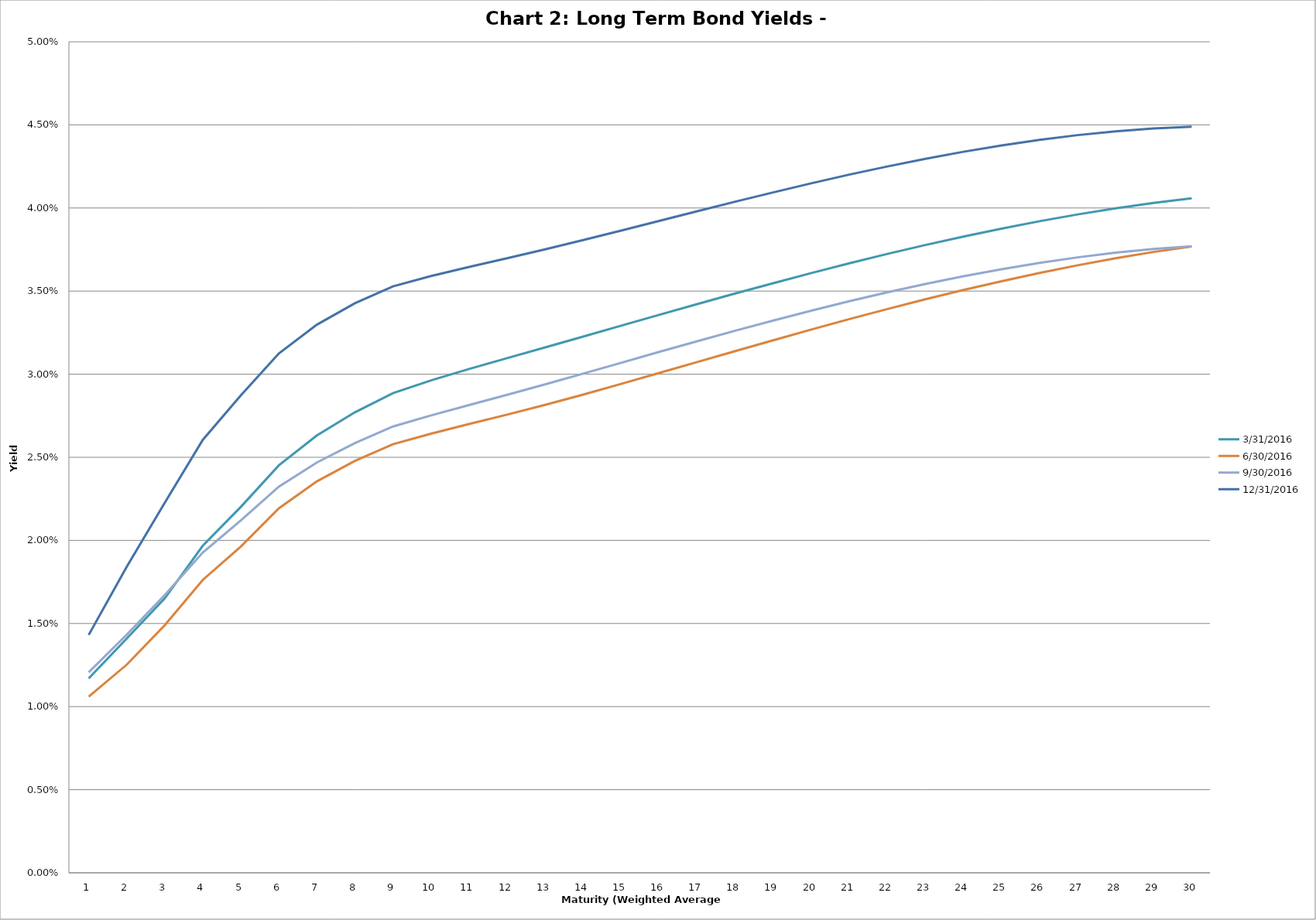
| Category | 3/31/2016 | 6/30/2016 | 9/30/2016 | 12/31/2016 |
|---|---|---|---|---|
| 0 | 0.012 | 0.011 | 0.012 | 0.014 |
| 1 | 0.014 | 0.013 | 0.014 | 0.018 |
| 2 | 0.017 | 0.015 | 0.017 | 0.022 |
| 3 | 0.02 | 0.018 | 0.019 | 0.026 |
| 4 | 0.022 | 0.02 | 0.021 | 0.029 |
| 5 | 0.025 | 0.022 | 0.023 | 0.031 |
| 6 | 0.026 | 0.024 | 0.025 | 0.033 |
| 7 | 0.028 | 0.025 | 0.026 | 0.034 |
| 8 | 0.029 | 0.026 | 0.027 | 0.035 |
| 9 | 0.03 | 0.026 | 0.028 | 0.036 |
| 10 | 0.03 | 0.027 | 0.028 | 0.036 |
| 11 | 0.031 | 0.028 | 0.029 | 0.037 |
| 12 | 0.032 | 0.028 | 0.029 | 0.038 |
| 13 | 0.032 | 0.029 | 0.03 | 0.038 |
| 14 | 0.033 | 0.029 | 0.031 | 0.039 |
| 15 | 0.034 | 0.03 | 0.031 | 0.039 |
| 16 | 0.034 | 0.031 | 0.032 | 0.04 |
| 17 | 0.035 | 0.031 | 0.033 | 0.04 |
| 18 | 0.035 | 0.032 | 0.033 | 0.041 |
| 19 | 0.036 | 0.033 | 0.034 | 0.041 |
| 20 | 0.037 | 0.033 | 0.034 | 0.042 |
| 21 | 0.037 | 0.034 | 0.035 | 0.043 |
| 22 | 0.038 | 0.035 | 0.035 | 0.043 |
| 23 | 0.038 | 0.035 | 0.036 | 0.043 |
| 24 | 0.039 | 0.036 | 0.036 | 0.044 |
| 25 | 0.039 | 0.036 | 0.037 | 0.044 |
| 26 | 0.04 | 0.037 | 0.037 | 0.044 |
| 27 | 0.04 | 0.037 | 0.037 | 0.045 |
| 28 | 0.04 | 0.037 | 0.038 | 0.045 |
| 29 | 0.041 | 0.038 | 0.038 | 0.045 |